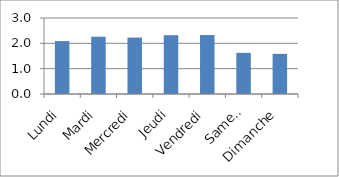
| Category | Series 0 |
|---|---|
| Lundi | 2.089 |
| Mardi | 2.263 |
| Mercredi | 2.227 |
| Jeudi | 2.32 |
| Vendredi | 2.327 |
| Samedi | 1.624 |
| Dimanche | 1.585 |